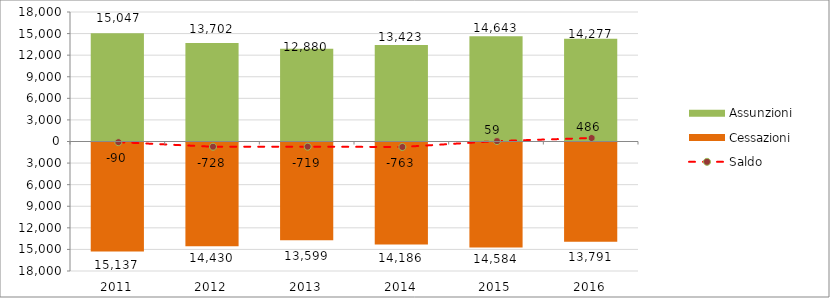
| Category | Assunzioni | Cessazioni |
|---|---|---|
| 2011.0 | 15047 | -15137 |
| 2012.0 | 13702 | -14430 |
| 2013.0 | 12880 | -13599 |
| 2014.0 | 13423 | -14186 |
| 2015.0 | 14643 | -14584 |
| 2016.0 | 14277 | -13791 |